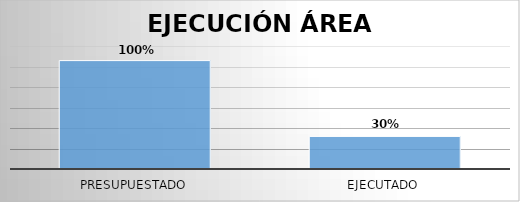
| Category | Series 0 |
|---|---|
| Presupuestado | 26438745722 |
| Ejecutado | 7949611110 |